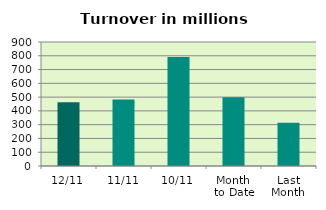
| Category | Series 0 |
|---|---|
| 12/11 | 462.051 |
| 11/11 | 481.759 |
| 10/11 | 791.907 |
| Month 
to Date | 499.006 |
| Last
Month | 314.143 |